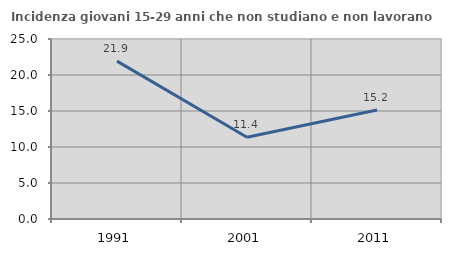
| Category | Incidenza giovani 15-29 anni che non studiano e non lavorano  |
|---|---|
| 1991.0 | 21.93 |
| 2001.0 | 11.364 |
| 2011.0 | 15.152 |